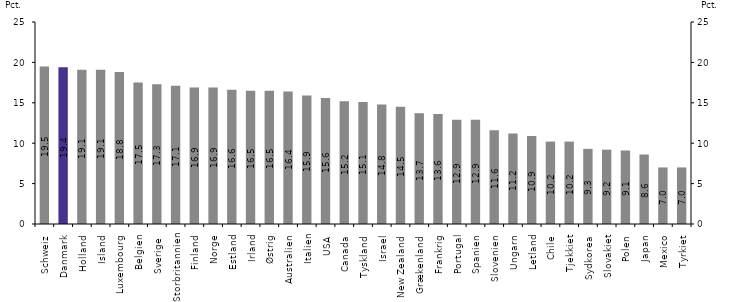
| Category | Andel af 10 pct. mest citerede |
|---|---|
| Schweiz | 19.5 |
| Danmark | 19.4 |
| Holland | 19.1 |
| Island | 19.1 |
| Luxembourg | 18.8 |
| Belgien | 17.5 |
| Sverige  | 17.3 |
| Storbritannien | 17.1 |
| Finland | 16.9 |
| Norge | 16.9 |
| Estland | 16.6 |
| Irland | 16.5 |
| Østrig | 16.5 |
| Australien | 16.4 |
| Italien | 15.9 |
| USA | 15.6 |
| Canada | 15.2 |
| Tyskland | 15.1 |
| Israel | 14.8 |
| New Zealand | 14.5 |
| Grækenland | 13.7 |
| Frankrig | 13.6 |
| Portugal | 12.9 |
| Spanien | 12.9 |
| Slovenien | 11.6 |
| Ungarn | 11.2 |
| Letland | 10.9 |
| Chile | 10.2 |
| Tjekkiet | 10.2 |
| Sydkorea | 9.3 |
| Slovakiet | 9.2 |
| Polen | 9.1 |
| Japan | 8.6 |
| Mexico | 7 |
| Tyrkiet | 7 |